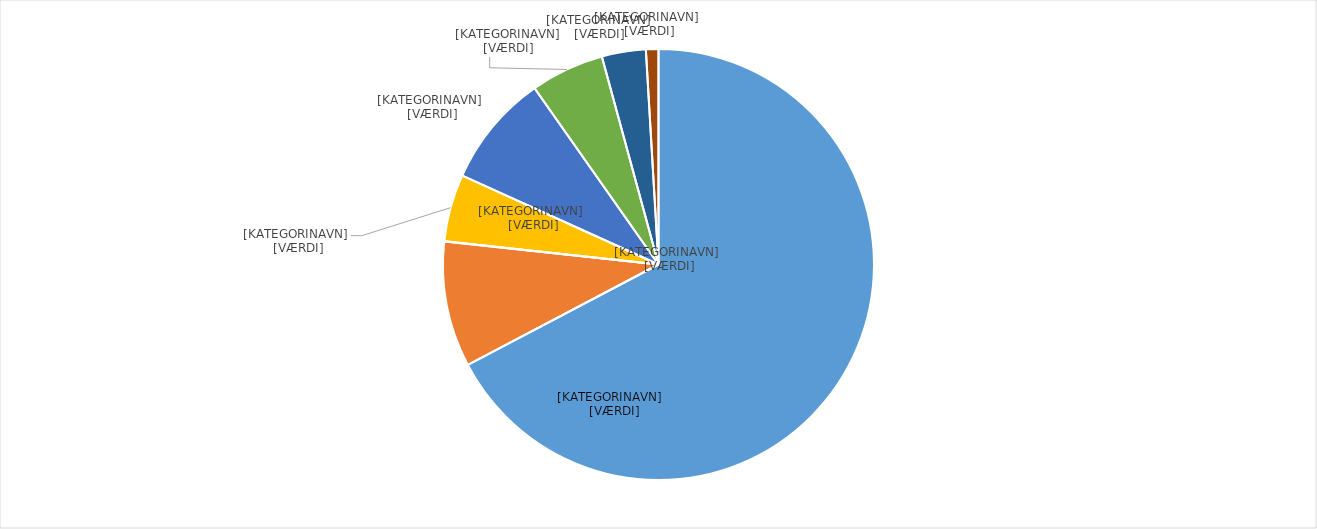
| Category | Series 0 |
|---|---|
| Gylle | 0.673 |
| Industriaffald | 0.094 |
| Spildevandsslam | 0 |
| Restprodukter og andet | 0.05 |
| Anden husdyrgødning | 0.085 |
| Energiafgrøder | 0.055 |
| Husholdningsaffald | 0.033 |
| Halm | 0.009 |